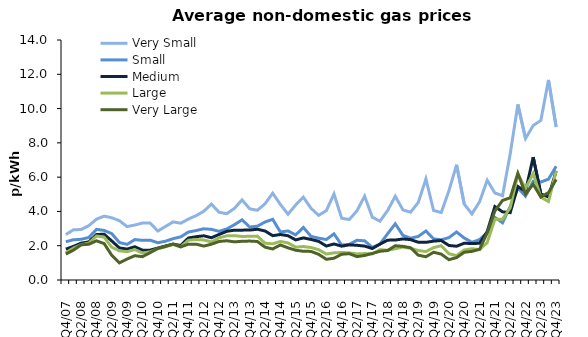
| Category | Very Small | Small | Medium | Large | Very Large |
|---|---|---|---|---|---|
| Q4/07  | 2.651 | 2.234 | 1.8 | 1.588 | 1.512 |
| Q1/08  | 2.927 | 2.347 | 1.962 | 1.862 | 1.743 |
| Q2/08  | 2.945 | 2.375 | 2.15 | 2.059 | 2.053 |
| Q3/08  | 3.168 | 2.48 | 2.222 | 2.148 | 2.085 |
| Q4/08  | 3.548 | 2.954 | 2.651 | 2.566 | 2.286 |
| Q1/09  | 3.727 | 2.892 | 2.672 | 2.501 | 2.124 |
| Q2/09  | 3.63 | 2.703 | 2.276 | 1.909 | 1.436 |
| Q3/09  | 3.458 | 2.184 | 1.869 | 1.7 | 0.998 |
| Q4/09  | 3.116 | 2.079 | 1.803 | 1.653 | 1.224 |
| Q1/10  | 3.205 | 2.357 | 1.94 | 1.775 | 1.418 |
| Q2/10  | 3.322 | 2.314 | 1.742 | 1.568 | 1.361 |
| Q3/10  | 3.326 | 2.323 | 1.742 | 1.642 | 1.593 |
| Q4/10  | 2.857 | 2.173 | 1.863 | 1.827 | 1.84 |
| Q1/11  | 3.12 | 2.263 | 1.982 | 1.933 | 1.959 |
| Q2/11  | 3.388 | 2.409 | 2.094 | 2.072 | 2.091 |
| Q3/11  | 3.313 | 2.518 | 2.012 | 1.939 | 1.933 |
| Q4/11  | 3.555 | 2.799 | 2.451 | 2.317 | 2.089 |
| Q1/12  | 3.752 | 2.883 | 2.525 | 2.361 | 2.093 |
| Q2/12  | 4.009 | 2.988 | 2.579 | 2.336 | 1.978 |
| Q3/12  | 4.425 | 2.955 | 2.466 | 2.222 | 2.087 |
| Q4/12  | 3.953 | 2.839 | 2.655 | 2.461 | 2.247 |
| Q1/13  | 3.867 | 2.977 | 2.84 | 2.577 | 2.29 |
| Q2/13  | 4.175 | 3.223 | 2.906 | 2.588 | 2.224 |
| Q3/13  | 4.673 | 3.511 | 2.908 | 2.539 | 2.259 |
| Q4/13  | 4.153 | 3.089 | 2.914 | 2.55 | 2.27 |
| Q1/14  | 4.067 | 3.14 | 2.959 | 2.56 | 2.246 |
| Q2/14  | 4.445 | 3.383 | 2.859 | 2.144 | 1.916 |
| Q3/14  | 5.063 | 3.54 | 2.586 | 2.111 | 1.812 |
| Q4/14  | 4.411 | 2.803 | 2.654 | 2.247 | 2.044 |
| Q1/15  | 3.837 | 2.861 | 2.584 | 2.165 | 1.875 |
| Q2/15  | 4.378 | 2.63 | 2.339 | 1.919 | 1.737 |
| Q3/15  | 4.832 | 3.068 | 2.456 | 1.952 | 1.674 |
| Q4/15  | 4.184 | 2.549 | 2.367 | 1.894 | 1.668 |
| Q1/16  | 3.773 | 2.441 | 2.254 | 1.771 | 1.497 |
| Q2/16  | 4.046 | 2.361 | 1.981 | 1.514 | 1.208 |
| Q3/16  | 5.021 | 2.692 | 2.101 | 1.584 | 1.27 |
| Q4/16  | 3.606 | 2.04 | 1.974 | 1.607 | 1.502 |
| Q1/17  | 3.529 | 2.079 | 2.05 | 1.583 | 1.536 |
| Q2/17  | 4.037 | 2.318 | 2.024 | 1.522 | 1.363 |
| Q3/17  | 4.892 | 2.286 | 1.978 | 1.543 | 1.43 |
| Q4/17  | 3.665 | 1.9 | 1.836 | 1.522 | 1.55 |
| Q1/18  | 3.43 | 2.099 | 2.09 | 1.77 | 1.675 |
| Q2/18  | 4.053 | 2.697 | 2.325 | 1.736 | 1.721 |
| Q3/18  | 4.883 | 3.277 | 2.33 | 1.822 | 1.999 |
| Q4/18  | 4.088 | 2.601 | 2.395 | 1.924 | 1.962 |
| Q1/19  | 3.953 | 2.437 | 2.355 | 1.849 | 1.881 |
| Q2/19  | 4.522 | 2.541 | 2.202 | 1.72 | 1.448 |
| Q3/19  | 5.895 | 2.859 | 2.197 | 1.659 | 1.357 |
| Q4/19  | 4.056 | 2.4 | 2.267 | 1.888 | 1.618 |
| Q1/20  | 3.937 | 2.345 | 2.302 | 2.001 | 1.511 |
| Q2/20  | 5.202 | 2.472 | 2.015 | 1.53 | 1.187 |
| Q3/20  | 6.724 | 2.802 | 1.97 | 1.423 | 1.305 |
| Q4/20  | 4.429 | 2.448 | 2.145 | 1.748 | 1.617 |
| Q1/21  | 3.859 | 2.201 | 2.126 | 1.827 | 1.67 |
| Q2/21  | 4.561 | 2.356 | 2.143 | 1.771 | 1.789 |
| Q3/21  | 5.819 | 2.759 | 2.826 | 2.18 | 2.749 |
| Q4/21  | 5.073 | 3.651 | 4.283 | 3.547 | 4.027 |
| Q1/22  | 4.913 | 3.338 | 3.975 | 3.549 | 4.642 |
| Q2/22  | 7.357 | 4.283 | 3.929 | 4.211 | 4.795 |
| Q3/22  | 10.242 | 5.371 | 5.455 | 6.181 | 6.225 |
| Q4/22  | 8.251 | 4.889 | 5.165 | 5.342 | 5.01 |
| Q1/23  | 9.006 | 5.757 | 7.167 | 6.209 | 5.586 |
| Q2/23  | 9.309 | 5.718 | 5.02 | 4.831 | 4.839 |
| Q3/23  | 11.673 | 5.883 | 4.838 | 4.577 | 5.1 |
| Q4/23  | 8.928 | 6.633 | 6.365 | 6.357 | 5.865 |